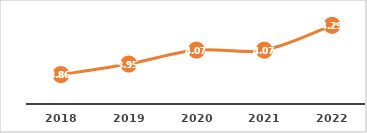
| Category | COBERTURA EN EL GRUPO DE EDAD DE LA EDUCACIÓN MEDIA SUPERIOR (%) |
|---|---|
| 2018.0 | 3.859 |
| 2019.0 | 3.951 |
| 2020.0 | 4.074 |
| 2021.0 | 4.073 |
| 2022.0 | 4.292 |